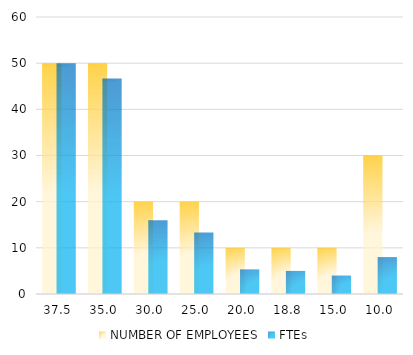
| Category | NUMBER OF EMPLOYEES | FTEs |
|---|---|---|
| 37.5 | 50 | 50 |
| 35.0 | 50 | 46.667 |
| 30.0 | 20 | 16 |
| 25.0 | 20 | 13.333 |
| 20.0 | 10 | 5.333 |
| 18.75 | 10 | 5 |
| 15.0 | 10 | 4 |
| 10.0 | 30 | 8 |